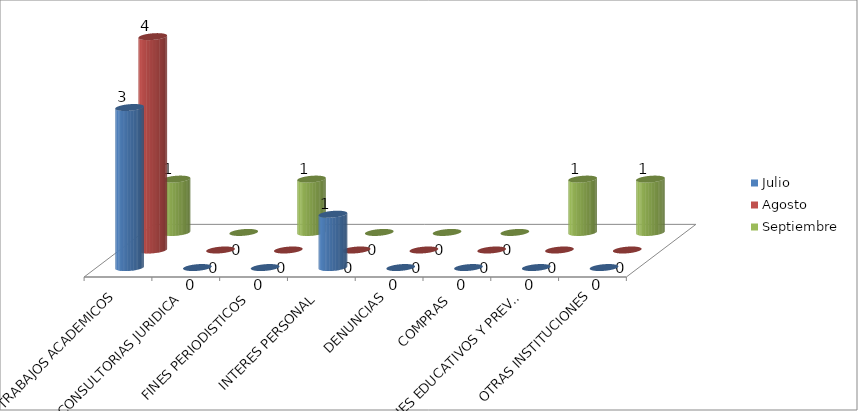
| Category | Julio | Agosto | Septiembre |
|---|---|---|---|
| TRABAJOS ACADEMICOS | 3 | 4 | 1 |
| CONSULTORIAS JURIDICA | 0 | 0 | 0 |
| FINES PERIODISTICOS | 0 | 0 | 1 |
| INTERES PERSONAL | 1 | 0 | 0 |
| DENUNCIAS | 0 | 0 | 0 |
| COMPRAS  | 0 | 0 | 0 |
| FINES EDUCATIVOS Y PREVENTIVOS | 0 | 0 | 1 |
| OTRAS INSTITUCIONES | 0 | 0 | 1 |